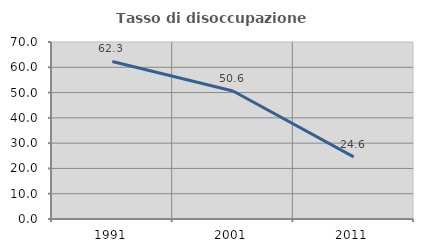
| Category | Tasso di disoccupazione giovanile  |
|---|---|
| 1991.0 | 62.315 |
| 2001.0 | 50.602 |
| 2011.0 | 24.561 |